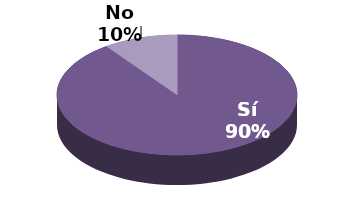
| Category | Series 1 |
|---|---|
| Sí | 18 |
| No | 2 |